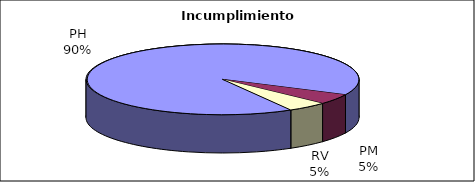
| Category | Efectivo |
|---|---|
| PH | 19 |
| PM | 1 |
| RV | 1 |